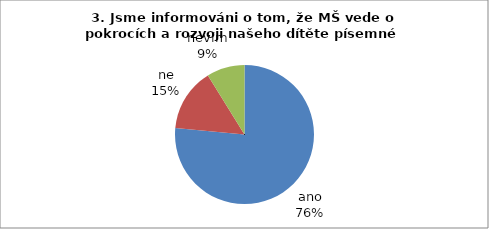
| Category | 3. |
|---|---|
| ano | 26 |
| ne | 5 |
| nevím | 3 |